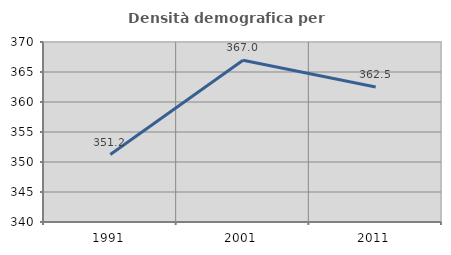
| Category | Densità demografica |
|---|---|
| 1991.0 | 351.234 |
| 2001.0 | 366.963 |
| 2011.0 | 362.514 |